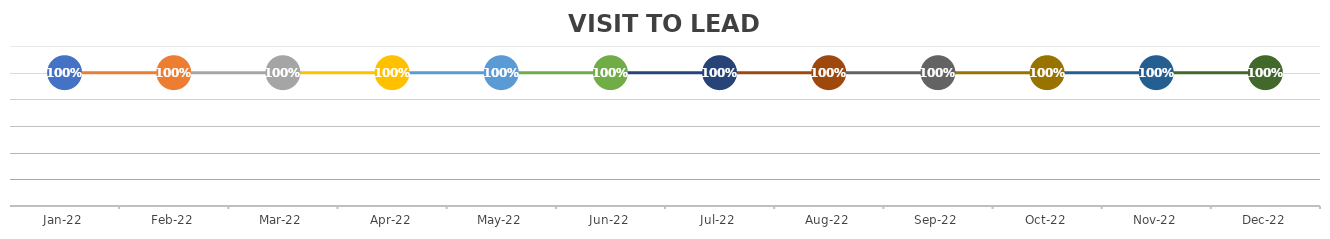
| Category | VISIT TO LEAD % |
|---|---|
| 2022-01-18 | 1 |
| 2022-02-18 | 1 |
| 2022-03-18 | 1 |
| 2022-04-18 | 1 |
| 2022-05-18 | 1 |
| 2022-06-18 | 1 |
| 2022-07-18 | 1 |
| 2022-08-18 | 1 |
| 2022-09-18 | 1 |
| 2022-10-18 | 1 |
| 2022-11-18 | 1 |
| 2022-12-18 | 1 |